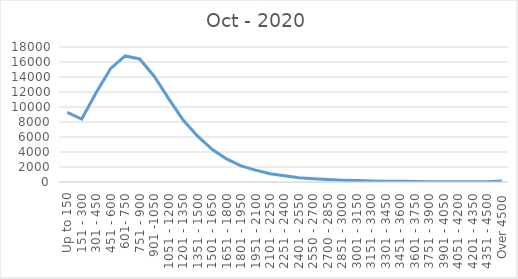
| Category | Oct - 2020 |
|---|---|
| Up to 150 | 9280 |
| 151 - 300 | 8393 |
| 301 - 450 | 11921 |
| 451 - 600 | 15136 |
| 601- 750 | 16804 |
| 751 - 900 | 16409 |
| 901 -1050 | 14112 |
| 1051 - 1200 | 11112 |
| 1201 - 1350 | 8270 |
| 1351 - 1500 | 6107 |
| 1501 - 1650 | 4350 |
| 1651 - 1800 | 3075 |
| 1801 - 1950 | 2147 |
| 1951 - 2100 | 1588 |
| 2101 - 2250 | 1099 |
| 2251 - 2400 | 829 |
| 2401 - 2550 | 565 |
| 2550 - 2700 | 431 |
| 2700 - 2850 | 321 |
| 2851 - 3000 | 243 |
| 3001 - 3150 | 194 |
| 3151 - 3300 | 148 |
| 3301 - 3450 | 114 |
| 3451 - 3600 | 89 |
| 3601 - 3750 | 59 |
| 3751 - 3900 | 42 |
| 3901 - 4050 | 43 |
| 4051 - 4200 | 35 |
| 4201 - 4350 | 34 |
| 4351 - 4500 | 30 |
| Over 4500 | 140 |